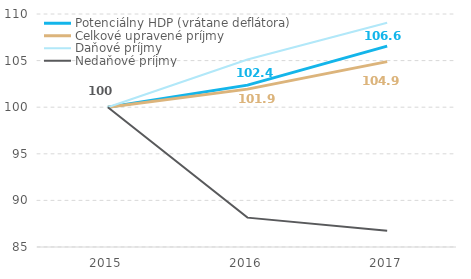
| Category | Potenciálny HDP (vrátane deflátora) | Celkové upravené príjmy | Daňové príjmy | Nedaňové príjmy |
|---|---|---|---|---|
| 2015.0 | 100 | 100 | 100 | 100 |
| 2016.0 | 102.368 | 101.94 | 105.112 | 88.151 |
| 2017.0 | 106.55 | 104.892 | 109.066 | 86.745 |